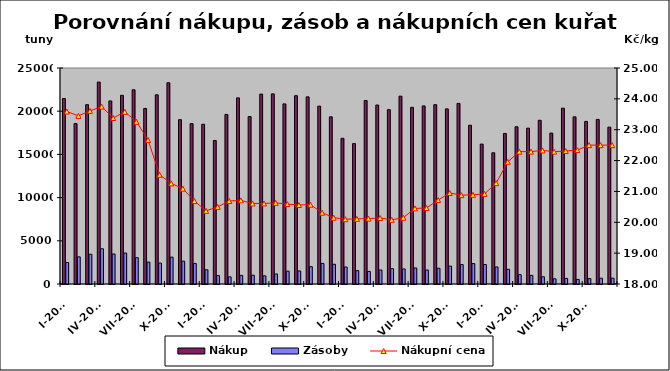
| Category | Nákup | Zásoby |
|---|---|---|
| I-2008 | 21461 | 2490 |
| II-2008 | 18572 | 3143 |
| III-2008 | 20753 | 3443 |
| IV-2008 | 23371 | 4077 |
| V-2008 | 21189 | 3473 |
| VI-2008 | 21835 | 3586 |
| VII-2008 | 22477 | 3050 |
| VIII-2008 | 20319 | 2534 |
| IX-2008 | 21897 | 2421 |
| X-2008 | 23290 | 3105 |
| XI-2008 | 19019 | 2645 |
| XII-2008 | 18563 | 2367 |
| I-2009 | 18484 | 1647 |
| II-2009 | 16606 | 972 |
| III-2009 | 19624 | 825 |
| IV-2009 | 21542 | 996 |
| V-2009 | 19385 | 1020 |
| VI-2009 | 21978 | 942 |
| VII-2009 | 22005 | 1160 |
| VIII-2009 | 20845 | 1488 |
| IX-2009 | 21795 | 1509 |
| X-2009 | 21658 | 2008 |
| XI-2009 | 20586 | 2377 |
| XII-2009 | 19350 | 2283 |
| I-2010 | 16861 | 1967 |
| II-2010 | 16248 | 1548 |
| III-2010 | 21234 | 1454 |
| IV-2010 | 20714 | 1622 |
| V-2010 | 20176 | 1768 |
| VI-2010 | 21741 | 1742 |
| VII-2010 | 20446 | 1855 |
| VIII-2010 | 20611 | 1615 |
| IX-2010 | 20755 | 1823 |
| X-2010 | 20270 | 2071 |
| XI-2010 | 20900 | 2248 |
| XII-2010 | 18374 | 2363 |
| I-2011 | 16193 | 2251 |
| II-2011 | 15184 | 1971 |
| III-2011 | 17422 | 1697 |
| IV-2011 | 18199 | 1077 |
| V-2011 | 18038 | 996 |
| VI-2011 | 18948 | 837 |
| VII-2011 | 17467 | 601 |
| VIII-2011 | 20347 | 646 |
| IX-2011 | 19346 | 527 |
| X-2011 | 18814 | 626 |
| XI-2011 | 19048 | 665 |
| XII-2011 | 18154 | 671 |